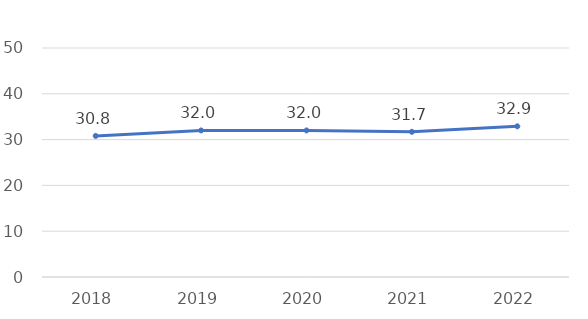
| Category | Series 0 |
|---|---|
| 2018.0 | 30.8 |
| 2019.0 | 32 |
| 2020.0 | 32 |
| 2021.0 | 31.7 |
| 2022.0 | 32.9 |